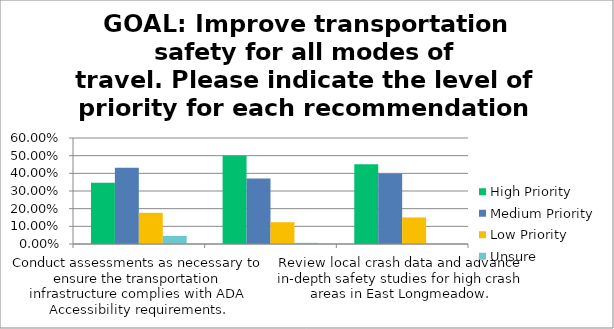
| Category | High Priority | Medium Priority | Low Priority | Unsure |
|---|---|---|---|---|
| Conduct assessments as necessary to ensure the transportation infrastructure complies with ADA Accessibility requirements. | 0.346 | 0.431 | 0.176 | 0.046 |
| Continue to participate in and advance improvement projects as part of the Massachusetts Safe Routes to School Program. | 0.5 | 0.37 | 0.123 | 0.007 |
| Review local crash data and advance in-depth safety studies for high crash areas in East Longmeadow. | 0.451 | 0.399 | 0.15 | 0 |